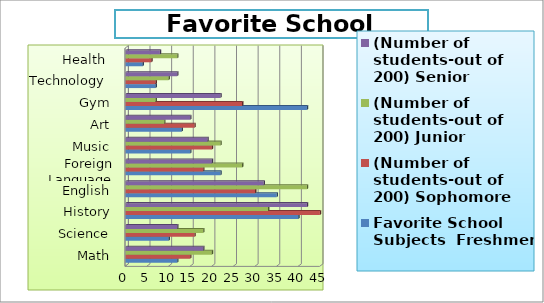
| Category | Favorite School Subjects  Freshmen | (Number of students-out of 200) Sophomore | (Number of students-out of 200) Junior | (Number of students-out of 200) Senior |
|---|---|---|---|---|
| Math | 12 | 15 | 20 | 18 |
| Science | 10 | 16 | 18 | 12 |
| History | 40 | 45 | 33 | 42 |
| English | 35 | 30 | 42 | 32 |
| Foreign Language | 22 | 18 | 27 | 20 |
| Music | 15 | 20 | 22 | 19 |
| Art | 13 | 16 | 9 | 15 |
| Gym | 42 | 27 | 7 | 22 |
| Technology  | 7 | 7 | 10 | 12 |
| Health  | 4 | 6 | 12 | 8 |